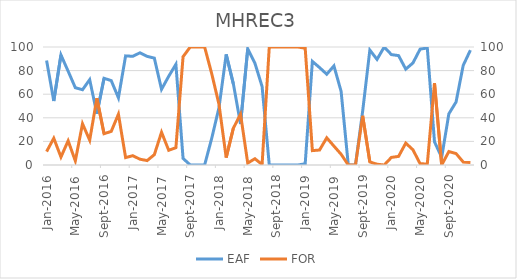
| Category | EAF |
|---|---|
| 2016-01-01 | 88.64 |
| 2016-02-01 | 54.22 |
| 2016-03-01 | 93.23 |
| 2016-04-01 | 79.51 |
| 2016-05-01 | 65.51 |
| 2016-06-01 | 63.78 |
| 2016-07-01 | 72.33 |
| 2016-08-01 | 43.41 |
| 2016-09-01 | 73.48 |
| 2016-10-01 | 71.5 |
| 2016-11-01 | 56.94 |
| 2016-12-01 | 92.46 |
| 2017-01-01 | 92.11 |
| 2017-02-01 | 95.1 |
| 2017-03-01 | 92.08 |
| 2017-04-01 | 90.57 |
| 2017-05-01 | 64.13 |
| 2017-06-01 | 75.19 |
| 2017-07-01 | 85.33 |
| 2017-08-01 | 5.57 |
| 2017-09-01 | 0 |
| 2017-10-01 | 0 |
| 2017-11-01 | 0 |
| 2017-12-01 | 22.89 |
| 2018-01-01 | 48.64 |
| 2018-02-01 | 93.7 |
| 2018-03-01 | 68.83 |
| 2018-04-01 | 34.81 |
| 2018-05-01 | 98.38 |
| 2018-06-01 | 86.28 |
| 2018-07-01 | 66.53 |
| 2018-08-01 | 0 |
| 2018-09-01 | 0 |
| 2018-10-01 | 0 |
| 2018-11-01 | 0 |
| 2018-12-01 | 0 |
| 2019-01-01 | 1.06 |
| 2019-02-01 | 87.81 |
| 2019-03-01 | 82.56 |
| 2019-04-01 | 76.94 |
| 2019-05-01 | 83.99 |
| 2019-06-01 | 62.4 |
| 2019-07-01 | 0 |
| 2019-08-01 | 0 |
| 2019-09-01 | 45.62 |
| 2019-10-01 | 97.39 |
| 2019-11-01 | 89.5 |
| 2019-12-01 | 100 |
| 2020-01-01 | 93.56 |
| 2020-02-01 | 92.71 |
| 2020-03-01 | 81.25 |
| 2020-04-01 | 86.47 |
| 2020-05-01 | 98.2 |
| 2020-06-01 | 99.17 |
| 2020-07-01 | 19.63 |
| 2020-08-01 | 6.49 |
| 2020-09-01 | 43.38 |
| 2020-10-01 | 53.36 |
| 2020-11-01 | 84.44 |
| 2020-12-01 | 97.32 |